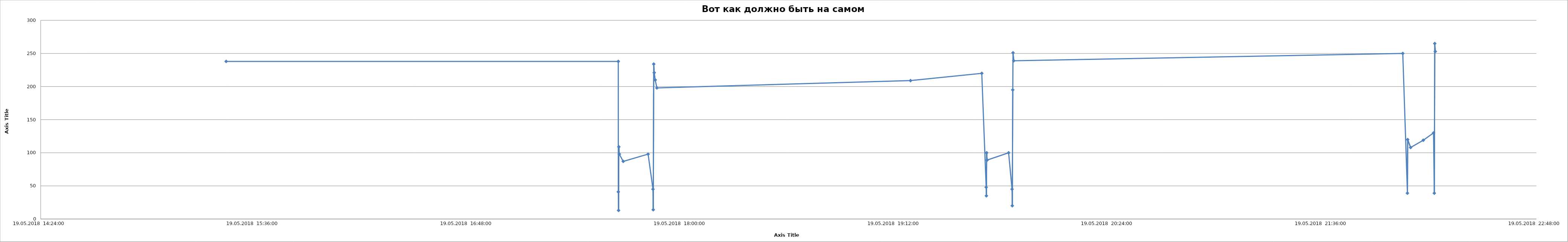
| Category | Series 0 |
|---|---|
| 43239.64341435185 | 238 |
| 43239.73516203704 | 238 |
| 43239.73517361111 | 41 |
| 43239.73523148148 | 13 |
| 43239.735289351855 | 109 |
| 43239.73540509259 | 98 |
| 43239.73631944445 | 87 |
| 43239.7421412037 | 98 |
| 43239.74328703704 | 45 |
| 43239.74334490741 | 14 |
| 43239.74346064815 | 234 |
| 43239.743576388886 | 221 |
| 43239.74380787037 | 210 |
| 43239.74420138889 | 198 |
| 43239.80355324074 | 209 |
| 43239.82021990741 | 220 |
| 43239.82125 | 48 |
| 43239.82130787037 | 35 |
| 43239.82136574074 | 100 |
| 43239.82148148148 | 89 |
| 43239.82650462963 | 100 |
| 43239.82730324074 | 45 |
| 43239.827361111114 | 20 |
| 43239.82747685185 | 195 |
| 43239.82753472222 | 251 |
| 43239.82770833333 | 239 |
| 43239.91873842593 | 250 |
| 43239.91982638889 | 39 |
| 43239.91988425926 | 120 |
| 43239.92056712963 | 108 |
| 43239.92354166666 | 119 |
| 43239.9259375 | 130 |
| 43239.92611111111 | 39 |
| 43239.92622685185 | 265 |
| 43239.92634259259 | 253 |